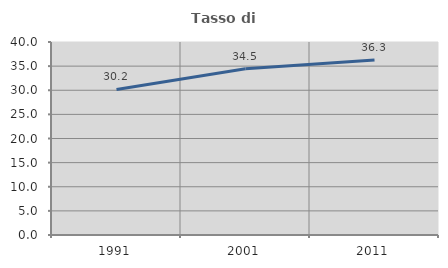
| Category | Tasso di occupazione   |
|---|---|
| 1991.0 | 30.157 |
| 2001.0 | 34.46 |
| 2011.0 | 36.275 |